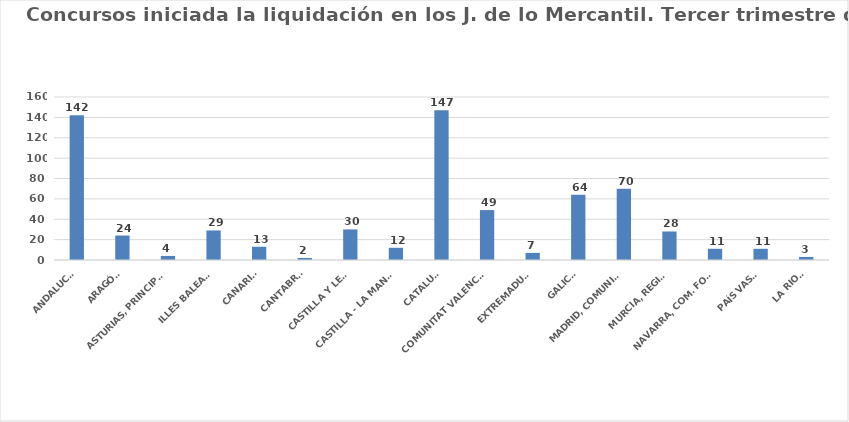
| Category | Series 0 |
|---|---|
| ANDALUCÍA | 142 |
| ARAGÓN | 24 |
| ASTURIAS, PRINCIPADO | 4 |
| ILLES BALEARS | 29 |
| CANARIAS | 13 |
| CANTABRIA | 2 |
| CASTILLA Y LEÓN | 30 |
| CASTILLA - LA MANCHA | 12 |
| CATALUÑA | 147 |
| COMUNITAT VALENCIANA | 49 |
| EXTREMADURA | 7 |
| GALICIA | 64 |
| MADRID, COMUNIDAD | 70 |
| MURCIA, REGIÓN | 28 |
| NAVARRA, COM. FORAL | 11 |
| PAÍS VASCO | 11 |
| LA RIOJA | 3 |